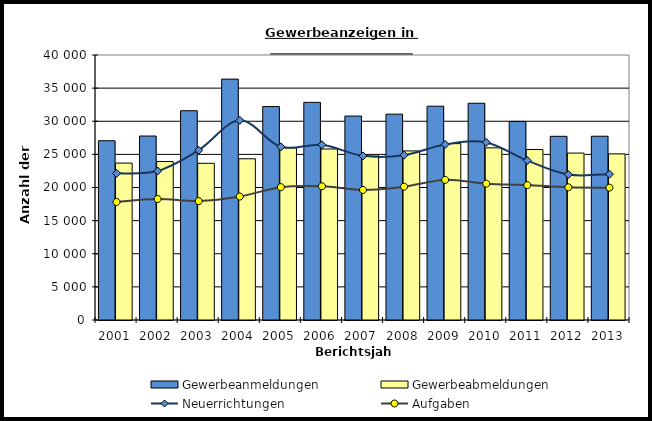
| Category | Gewerbeanmeldungen | Gewerbeabmeldungen |
|---|---|---|
| 2001.0 | 27056 | 23688 |
| 2002.0 | 27771 | 23929 |
| 2003.0 | 31587 | 23654 |
| 2004.0 | 36359 | 24336 |
| 2005.0 | 32219 | 25984 |
| 2006.0 | 32847 | 25816 |
| 2007.0 | 30781 | 24926 |
| 2008.0 | 31074 | 25523 |
| 2009.0 | 32271 | 26623 |
| 2010.0 | 32718 | 25984 |
| 2011.0 | 29971 | 25729 |
| 2012.0 | 27728 | 25195 |
| 2013.0 | 27739 | 25071 |